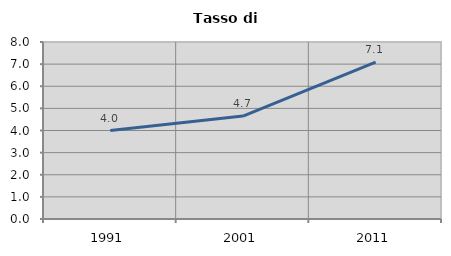
| Category | Tasso di disoccupazione   |
|---|---|
| 1991.0 | 4 |
| 2001.0 | 4.651 |
| 2011.0 | 7.092 |